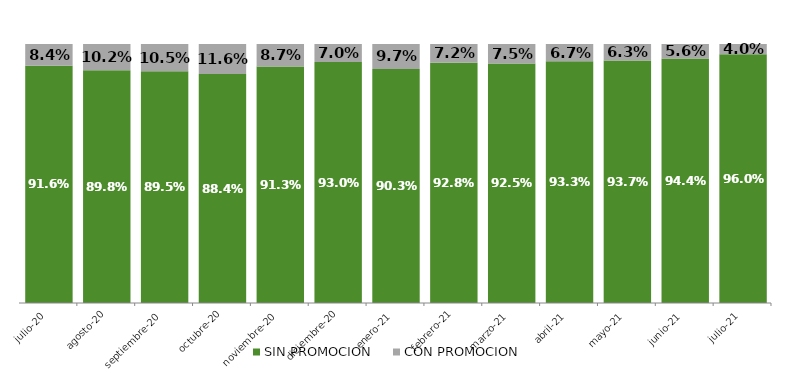
| Category | SIN PROMOCION   | CON PROMOCION   |
|---|---|---|
| 2020-07-01 | 0.916 | 0.084 |
| 2020-08-01 | 0.898 | 0.102 |
| 2020-09-01 | 0.895 | 0.105 |
| 2020-10-01 | 0.884 | 0.116 |
| 2020-11-01 | 0.913 | 0.087 |
| 2020-12-01 | 0.93 | 0.07 |
| 2021-01-01 | 0.903 | 0.097 |
| 2021-02-01 | 0.928 | 0.072 |
| 2021-03-01 | 0.925 | 0.075 |
| 2021-04-01 | 0.933 | 0.067 |
| 2021-05-01 | 0.937 | 0.063 |
| 2021-06-01 | 0.944 | 0.056 |
| 2021-07-01 | 0.96 | 0.04 |